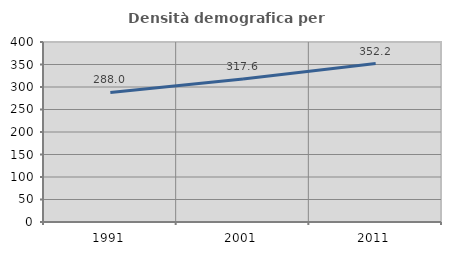
| Category | Densità demografica |
|---|---|
| 1991.0 | 288.025 |
| 2001.0 | 317.555 |
| 2011.0 | 352.153 |